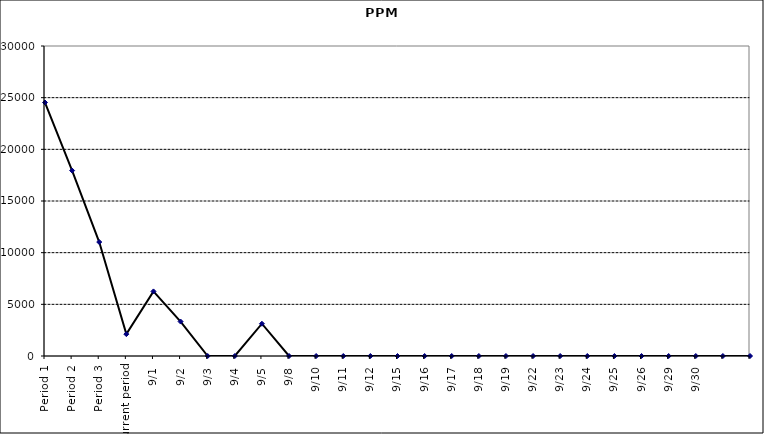
| Category | Series 0 |
|---|---|
| Period 1 | 24531.25 |
| Period 2 | 17945.205 |
| Period 3 | 11029.412 |
| Current period | 2116.402 |
| 9/1 | 6250 |
| 9/2 | 3333.333 |
| 9/3 | 0 |
| 9/4 | 0 |
| 9/5 | 3125 |
| 9/8 | 0 |
| 9/10 | 0 |
| 9/11 | 0 |
| 9/12 | 0 |
| 9/15 | 0 |
| 9/16 | 0 |
| 9/17 | 0 |
| 9/18 | 0 |
| 9/19 | 0 |
| 9/22 | 0 |
| 9/23 | 0 |
| 9/24 | 0 |
| 9/25 | 0 |
| 9/26 | 0 |
| 9/29 | 0 |
| 9/30 | 0 |